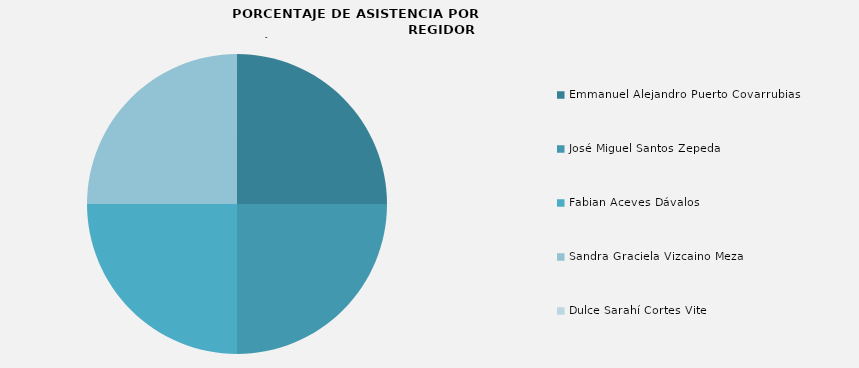
| Category | Series 0 |
|---|---|
| Emmanuel Alejandro Puerto Covarrubias | 100 |
| José Miguel Santos Zepeda | 100 |
| Fabian Aceves Dávalos | 100 |
| Sandra Graciela Vizcaino Meza | 100 |
| Dulce Sarahí Cortes Vite | 0 |